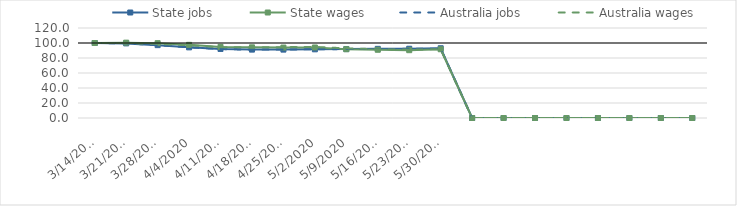
| Category | State jobs | State wages | Australia jobs | Australia wages |
|---|---|---|---|---|
| 14/03/2020 | 100 | 100 | 100 | 100 |
| 21/03/2020 | 99.486 | 100.462 | 99.552 | 99.902 |
| 28/03/2020 | 97.127 | 99.776 | 97.088 | 98.771 |
| 04/04/2020 | 94.181 | 97.545 | 94.15 | 97.007 |
| 11/04/2020 | 92.08 | 94.826 | 91.933 | 94.434 |
| 18/04/2020 | 91.172 | 94.221 | 91.108 | 94.115 |
| 25/04/2020 | 91.182 | 93.915 | 91.306 | 94.452 |
| 02/05/2020 | 91.567 | 94.027 | 91.63 | 94.778 |
| 09/05/2020 | 91.87 | 91.726 | 91.91 | 92.892 |
| 16/05/2020 | 92.207 | 90.963 | 92.165 | 91.712 |
| 23/05/2020 | 92.344 | 90.413 | 92.167 | 91.106 |
| 30/05/2020 | 92.994 | 91.647 | 92.546 | 91.708 |